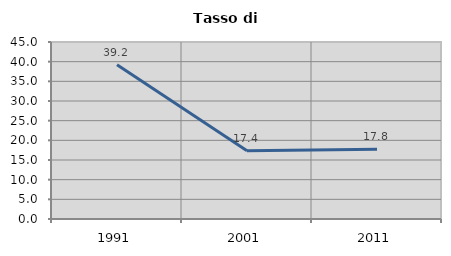
| Category | Tasso di disoccupazione   |
|---|---|
| 1991.0 | 39.226 |
| 2001.0 | 17.357 |
| 2011.0 | 17.758 |